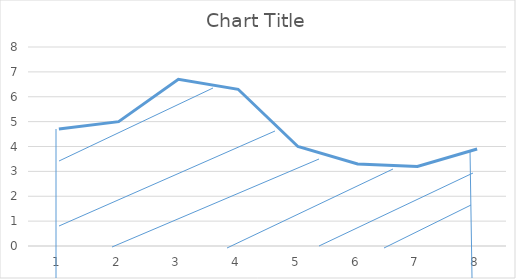
| Category | Series 0 |
|---|---|
| 0 | 4.7 |
| 1 | 5 |
| 2 | 6.7 |
| 3 | 6.3 |
| 4 | 4 |
| 5 | 3.3 |
| 6 | 3.2 |
| 7 | 3.9 |